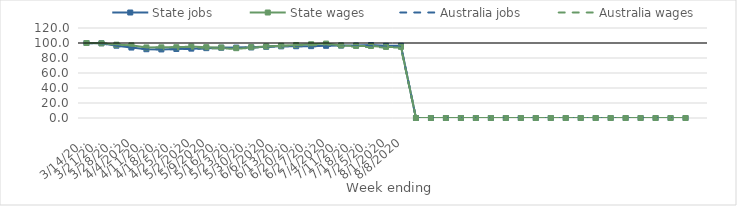
| Category | State jobs | State wages | Australia jobs | Australia wages |
|---|---|---|---|---|
| 14/03/2020 | 100 | 100 | 100 | 100 |
| 21/03/2020 | 99.614 | 99.621 | 99.296 | 99.679 |
| 28/03/2020 | 96.396 | 97.752 | 96.376 | 98.416 |
| 04/04/2020 | 93.918 | 96.86 | 93.719 | 96.743 |
| 11/04/2020 | 91.696 | 94.064 | 91.949 | 94.153 |
| 18/04/2020 | 91.424 | 94.191 | 91.46 | 94.028 |
| 25/04/2020 | 92.021 | 94.37 | 91.774 | 94.242 |
| 02/05/2020 | 92.491 | 95.192 | 92.164 | 94.699 |
| 09/05/2020 | 93.139 | 94.462 | 92.706 | 93.349 |
| 16/05/2020 | 93.721 | 94.032 | 93.235 | 92.689 |
| 23/05/2020 | 93.876 | 93.102 | 93.534 | 92.291 |
| 30/05/2020 | 94.139 | 94.454 | 94.056 | 93.572 |
| 06/06/2020 | 94.958 | 95.433 | 94.996 | 95.371 |
| 13/06/2020 | 95.533 | 96.382 | 95.462 | 96.012 |
| 20/06/2020 | 95.701 | 97.334 | 95.685 | 96.877 |
| 27/06/2020 | 95.816 | 98.317 | 95.589 | 96.891 |
| 04/07/2020 | 96.267 | 99.246 | 96.048 | 98.279 |
| 11/07/2020 | 96.553 | 96.756 | 96.137 | 95.659 |
| 18/07/2020 | 96.733 | 96.09 | 95.918 | 95.021 |
| 25/07/2020 | 97.222 | 96.002 | 95.887 | 94.374 |
| 01/08/2020 | 96.236 | 94.755 | 95.429 | 94.068 |
| 08/08/2020 | 96.341 | 94.829 | 95.147 | 93.816 |